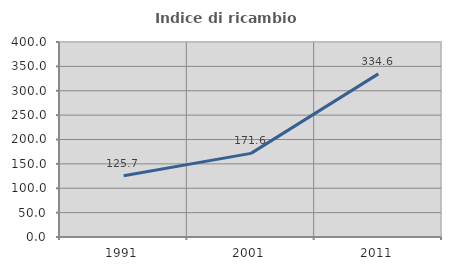
| Category | Indice di ricambio occupazionale  |
|---|---|
| 1991.0 | 125.685 |
| 2001.0 | 171.56 |
| 2011.0 | 334.632 |